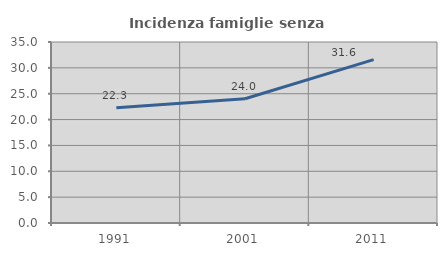
| Category | Incidenza famiglie senza nuclei |
|---|---|
| 1991.0 | 22.309 |
| 2001.0 | 24.029 |
| 2011.0 | 31.582 |